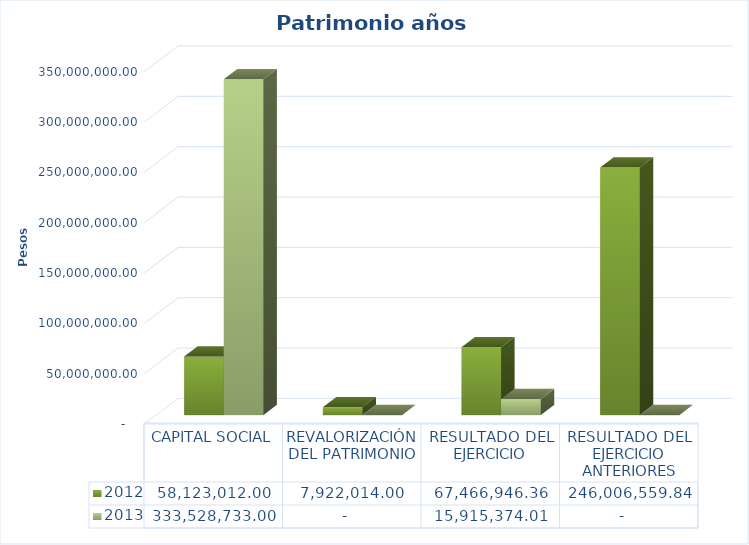
| Category | 2012 | 2013 |
|---|---|---|
| CAPITAL SOCIAL | 58123012 | 333528733 |
| REVALORIZACIÓN DEL PATRIMONIO | 7922014 | 0 |
| RESULTADO DEL EJERCICIO | 67466946.36 | 15915374.01 |
| RESULTADO DEL EJERCICIO ANTERIORES | 246006559.84 | 0 |